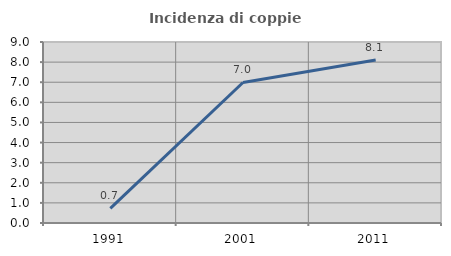
| Category | Incidenza di coppie miste |
|---|---|
| 1991.0 | 0.73 |
| 2001.0 | 6.987 |
| 2011.0 | 8.108 |